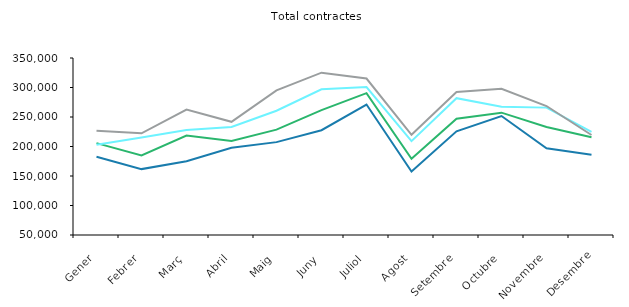
| Category | 2014 | 2015 | 2016 | 2017 |
|---|---|---|---|---|
| Gener | 182613 | 205752 | 202894 | 226590 |
| Febrer | 161681 | 184801 | 215393 | 222369 |
| Març | 175114 | 218599 | 227813 | 262621 |
| Abril | 197989 | 209507 | 232941 | 241820 |
| Maig | 207404 | 228588 | 260571 | 295142 |
| Juny | 227619 | 261682 | 296891 | 325132 |
| Juliol | 271151 | 290500 | 300852 | 315227 |
| Agost | 157650 | 179251 | 209088 | 219884 |
| Setembre | 225717 | 247158 | 281932 | 292461 |
| Octubre | 251638 | 257351 | 267442 | 297849 |
| Novembre | 197027 | 232979 | 265890 | 268606 |
| Desembre | 186014 | 215647 | 224851 | 219458 |